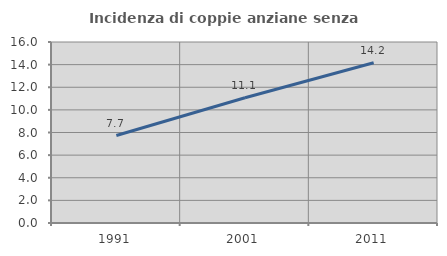
| Category | Incidenza di coppie anziane senza figli  |
|---|---|
| 1991.0 | 7.733 |
| 2001.0 | 11.068 |
| 2011.0 | 14.162 |